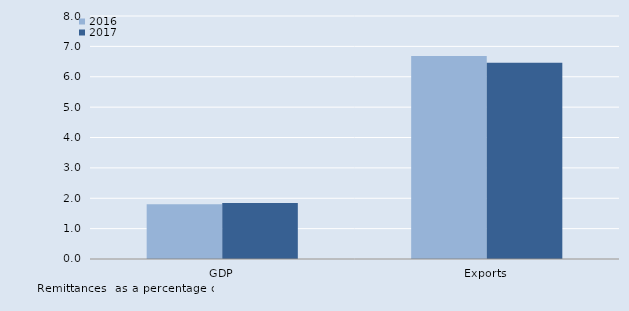
| Category | 2016 | 2017 |
|---|---|---|
| GDP | 1.802 | 1.841 |
| Exports | 6.681 | 6.46 |